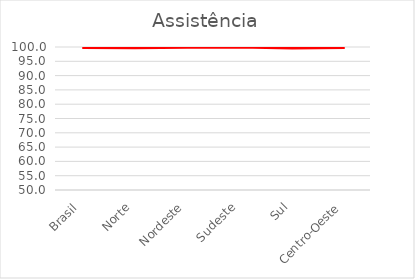
| Category | Assistência |
|---|---|
| Brasil | 99.856 |
| Norte | 99.778 |
| Nordeste | 99.889 |
| Sudeste | 100 |
| Sul | 99.664 |
| Centro-Oeste | 99.786 |